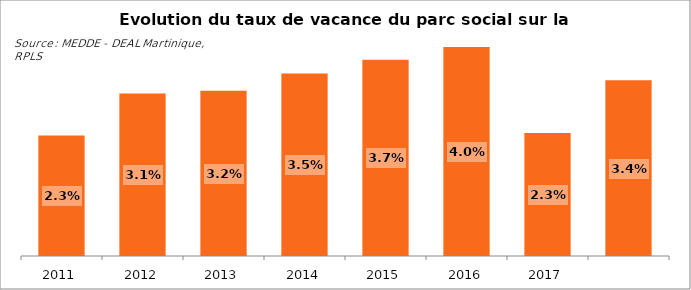
| Category | 2011 |
|---|---|
| 2011.0 | 0.023 |
| 2012.0 | 0.031 |
| 2013.0 | 0.032 |
| 2014.0 | 0.035 |
| 2015.0 | 0.037 |
| 2016.0 | 0.04 |
| 2017.0 | 0.023 |